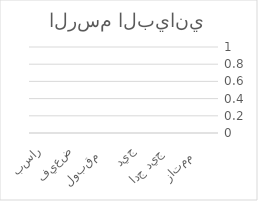
| Category | Series 0 | Series 1 |
|---|---|---|
| ممتاز   | 0 |  |
| جيد جدا  | 0 |  |
| جيد | 0 |  |
| مقبول   | 0 |  |
| ضعيف | 0 |  |
| راسب | 0 |  |